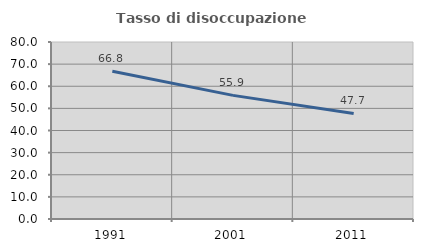
| Category | Tasso di disoccupazione giovanile  |
|---|---|
| 1991.0 | 66.753 |
| 2001.0 | 55.873 |
| 2011.0 | 47.712 |